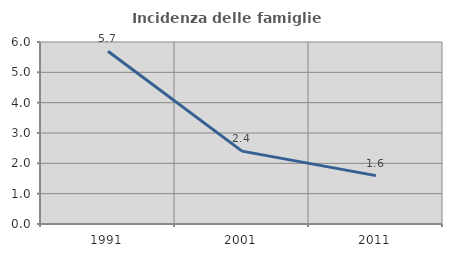
| Category | Incidenza delle famiglie numerose |
|---|---|
| 1991.0 | 5.693 |
| 2001.0 | 2.402 |
| 2011.0 | 1.595 |